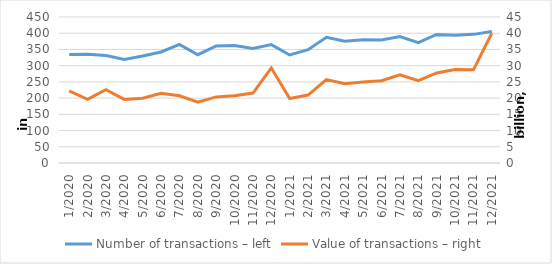
| Category | Number of transactions – left |
|---|---|
| 1/2020 | 334778 |
| 2/2020 | 335533 |
| 3/2020 | 331555 |
| 4/2020 | 319128 |
| 5/2020 | 329820 |
| 6/2020 | 342182 |
| 7/2020 | 365587 |
| 8/2020 | 333814 |
| 9/2020 | 360919 |
| 10/2020 | 362038 |
| 11/2020 | 353021 |
| 12/2020 | 364975 |
| 1/2021 | 333014 |
| 2/2021 | 349354 |
| 3/2021 | 387439 |
| 4/2021 | 375411 |
| 5/2021 | 379631 |
| 6/2021 | 379107 |
| 7/2021 | 390007 |
| 8/2021 | 370722 |
| 9/2021 | 396218 |
| 10/2021 | 393681 |
| 11/2021 | 396476 |
| 12/2021 | 405496 |